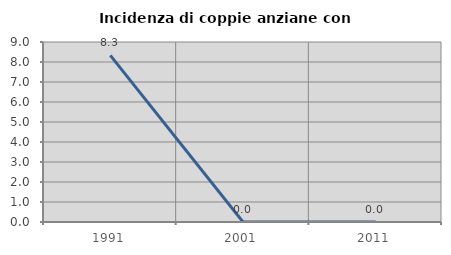
| Category | Incidenza di coppie anziane con figli |
|---|---|
| 1991.0 | 8.333 |
| 2001.0 | 0 |
| 2011.0 | 0 |